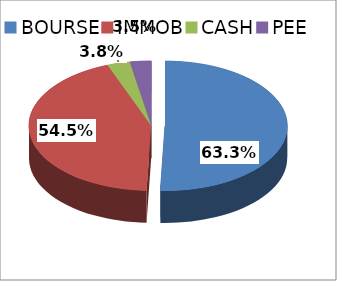
| Category | Series 0 |
|---|---|
| BOURSE | 0.632 |
| IMMOB | 0.545 |
| CASH | 0.038 |
| PEE | 0.035 |